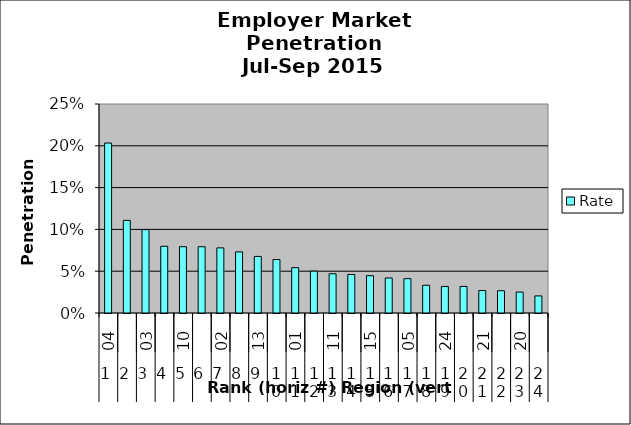
| Category | Rate |
|---|---|
| 0 | 0.203 |
| 1 | 0.111 |
| 2 | 0.1 |
| 3 | 0.08 |
| 4 | 0.079 |
| 5 | 0.079 |
| 6 | 0.078 |
| 7 | 0.073 |
| 8 | 0.068 |
| 9 | 0.064 |
| 10 | 0.054 |
| 11 | 0.05 |
| 12 | 0.047 |
| 13 | 0.046 |
| 14 | 0.045 |
| 15 | 0.042 |
| 16 | 0.041 |
| 17 | 0.033 |
| 18 | 0.032 |
| 19 | 0.032 |
| 20 | 0.027 |
| 21 | 0.027 |
| 22 | 0.025 |
| 23 | 0.02 |